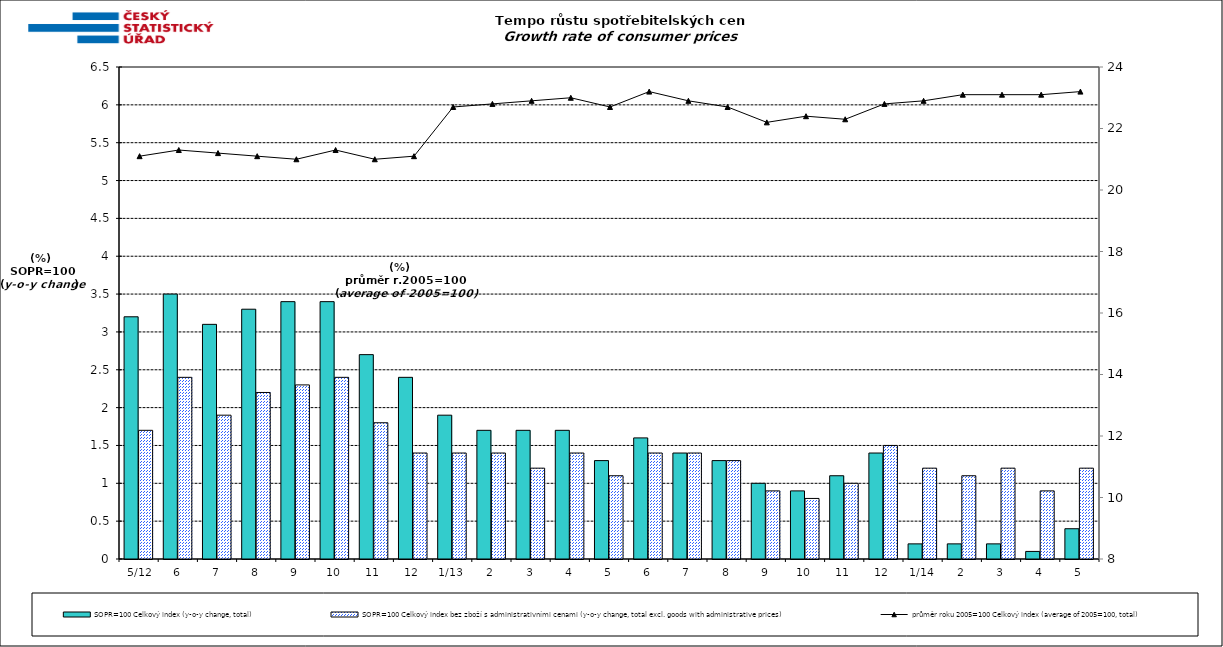
| Category | SOPR=100 Celkový index (y-o-y change, total) | SOPR=100 Celkový index bez zboží s administrativními cenami (y-o-y change, total excl. goods with administrative prices)  |
|---|---|---|
|  5/12 | 3.2 | 1.7 |
| 6 | 3.5 | 2.4 |
| 7 | 3.1 | 1.9 |
| 8 | 3.3 | 2.2 |
| 9 | 3.4 | 2.3 |
| 10 | 3.4 | 2.4 |
| 11 | 2.7 | 1.8 |
| 12 | 2.4 | 1.4 |
| 1/13 | 1.9 | 1.4 |
| 2 | 1.7 | 1.4 |
| 3 | 1.7 | 1.2 |
| 4 | 1.7 | 1.4 |
| 5 | 1.3 | 1.1 |
| 6 | 1.6 | 1.4 |
| 7 | 1.4 | 1.4 |
| 8 | 1.3 | 1.3 |
| 9 | 1 | 0.9 |
| 10 | 0.9 | 0.8 |
| 11 | 1.1 | 1 |
| 12 | 1.4 | 1.5 |
| 1/14 | 0.2 | 1.2 |
| 2 | 0.2 | 1.1 |
| 3 | 0.2 | 1.2 |
| 4 | 0.1 | 0.9 |
| 5 | 0.4 | 1.2 |